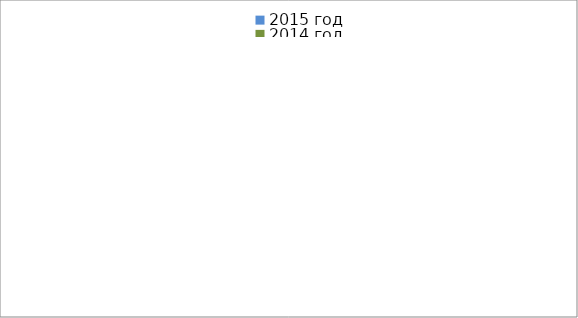
| Category | 2015 год | 2014 год |
|---|---|---|
|  - поджог | 18 | 16 |
|  - неосторожное обращение с огнём | 56 | 34 |
|  - НПТЭ электрооборудования | 8 | 17 |
|  - НПУ и Э печей | 53 | 53 |
|  - НПУ и Э транспортных средств | 42 | 48 |
|   -Шалость с огнем детей | 3 | 0 |
|  -НППБ при эксплуатации эл.приборов | 13 | 17 |
|  - курение | 19 | 19 |
| - прочие | 73 | 78 |
| - не установленные причины | 9 | 7 |